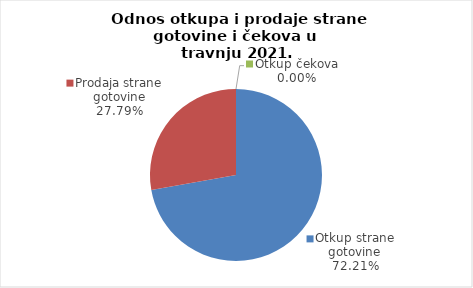
| Category | Series 0 |
|---|---|
| Otkup strane gotovine | 72.206 |
| Prodaja strane gotovine | 27.794 |
| Otkup čekova | 0 |